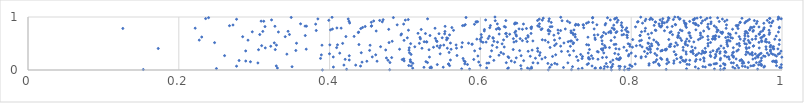
| Category | Series 0 |
|---|---|
| 0.3905048198245329 | 0.001 |
| 0.7738127976888061 | 0.002 |
| 0.6900753211355986 | 0.003 |
| 0.7908255134271223 | 0.004 |
| 0.4796547988831211 | 0.005 |
| 0.7970201570726542 | 0.006 |
| 0.7208183194869331 | 0.007 |
| 0.9183959894101316 | 0.008 |
| 0.15294919381346206 | 0.009 |
| 0.846394380932775 | 0.01 |
| 0.922346852742754 | 0.011 |
| 0.42253959025184973 | 0.012 |
| 0.784544756717684 | 0.013 |
| 0.9676414386958906 | 0.014 |
| 0.7953047466959094 | 0.015 |
| 0.6653484240710663 | 0.016 |
| 0.5856118271513883 | 0.017 |
| 0.6542613000240567 | 0.018 |
| 0.9103594176026336 | 0.019 |
| 0.7638921585774706 | 0.02 |
| 0.7299505027760544 | 0.021 |
| 0.5751593932999293 | 0.022 |
| 0.7974040987820787 | 0.023 |
| 0.8733977197972445 | 0.024 |
| 0.8890820511830615 | 0.025 |
| 0.9235077114308794 | 0.026 |
| 0.2499094500486988 | 0.027 |
| 0.6361368216130133 | 0.028 |
| 0.6677869760505721 | 0.029 |
| 0.9237443775877484 | 0.03 |
| 0.9375329926575916 | 0.031 |
| 0.7520016153193633 | 0.032 |
| 0.734953070227601 | 0.033 |
| 0.5102352320256716 | 0.034 |
| 0.7591149152228475 | 0.035 |
| 0.6625331058925109 | 0.036 |
| 0.3307786703149538 | 0.037 |
| 0.7525126982944311 | 0.038 |
| 0.6371302979966856 | 0.039 |
| 0.6082745748076372 | 0.04 |
| 0.942459709398385 | 0.041 |
| 0.535119084347013 | 0.042 |
| 0.533118979787762 | 0.043 |
| 0.759464547152684 | 0.044 |
| 0.9546954003962151 | 0.045 |
| 0.9989041471396894 | 0.046 |
| 0.710180595630532 | 0.047 |
| 0.7733843117872463 | 0.048 |
| 0.9969484423284773 | 0.049 |
| 0.69197578105246 | 0.05 |
| 0.5251347392804779 | 0.051 |
| 0.6677748083590128 | 0.052 |
| 0.5507109747615511 | 0.053 |
| 0.9760164124028549 | 0.054 |
| 0.9347862776638626 | 0.055 |
| 0.40503388160841103 | 0.056 |
| 0.8983183733666544 | 0.057 |
| 0.8850537342346565 | 0.058 |
| 0.5345463826150181 | 0.059 |
| 0.7685426735535689 | 0.06 |
| 0.7916203923650474 | 0.061 |
| 0.3502188485587554 | 0.062 |
| 0.7221779189248643 | 0.063 |
| 0.8951263731724802 | 0.064 |
| 0.9510541901273755 | 0.065 |
| 0.764713271073447 | 0.066 |
| 0.7855349146808733 | 0.067 |
| 0.8010623038665897 | 0.068 |
| 0.7747429464981311 | 0.069 |
| 0.9769238045720872 | 0.07 |
| 0.7836980896393945 | 0.071 |
| 0.27660855486428404 | 0.072 |
| 0.947489758424717 | 0.073 |
| 0.44103963272965263 | 0.074 |
| 0.9183061743754898 | 0.075 |
| 0.7480713557899352 | 0.076 |
| 0.32927721329372617 | 0.077 |
| 0.9586406092406937 | 0.078 |
| 0.5083031809050245 | 0.079 |
| 0.9616354059344437 | 0.08 |
| 0.9927060711275126 | 0.081 |
| 0.6535575016207752 | 0.082 |
| 0.5591746220625606 | 0.083 |
| 0.5050097144331767 | 0.084 |
| 0.9728175108331906 | 0.085 |
| 0.9403193579383974 | 0.086 |
| 0.8373695138190237 | 0.087 |
| 0.5998307010535655 | 0.088 |
| 0.7987470262009593 | 0.089 |
| 0.9630016841809999 | 0.09 |
| 0.8235845673075779 | 0.091 |
| 0.43463895545624476 | 0.092 |
| 0.4189924506640238 | 0.093 |
| 0.79818685802427 | 0.094 |
| 0.92431549416155 | 0.095 |
| 0.9053916399881311 | 0.096 |
| 0.9034092963105984 | 0.097 |
| 0.9690382058839365 | 0.098 |
| 0.6942717289491019 | 0.099 |
| 0.9716354357963808 | 0.1 |
| 0.9990896823401126 | 0.101 |
| 0.542846689022822 | 0.102 |
| 0.8769924625597483 | 0.103 |
| 0.5828850139414581 | 0.104 |
| 0.7416592290282833 | 0.105 |
| 0.9725322339929973 | 0.106 |
| 0.8740272073842016 | 0.107 |
| 0.7755918448350752 | 0.108 |
| 0.7016887131137876 | 0.109 |
| 0.924225238487193 | 0.11 |
| 0.5576051586932478 | 0.111 |
| 0.8053340831928248 | 0.112 |
| 0.5579664821670706 | 0.113 |
| 0.8361376299534353 | 0.114 |
| 0.9098438195560918 | 0.115 |
| 0.5793100637340978 | 0.116 |
| 0.8471633120094336 | 0.117 |
| 0.9114435994927238 | 0.118 |
| 0.8237766928915955 | 0.119 |
| 0.9223498850270061 | 0.12 |
| 0.7432982188990607 | 0.121 |
| 0.7668727416283404 | 0.122 |
| 0.9133156376722242 | 0.123 |
| 0.689494486758474 | 0.124 |
| 0.698679315955748 | 0.125 |
| 0.5103847923105798 | 0.126 |
| 0.9473556615162251 | 0.127 |
| 0.8564774082304634 | 0.128 |
| 0.6085994240771182 | 0.129 |
| 0.9493056169688389 | 0.13 |
| 0.6762094366822575 | 0.131 |
| 0.6112405184097952 | 0.132 |
| 0.3049022149635786 | 0.133 |
| 0.9356267606062876 | 0.134 |
| 0.7160297520842237 | 0.135 |
| 0.6698222393719883 | 0.136 |
| 0.93273133067166 | 0.137 |
| 0.634361254721083 | 0.138 |
| 0.966071798043755 | 0.139 |
| 0.5298525448837276 | 0.14 |
| 0.48002623757039753 | 0.141 |
| 0.8297128226485253 | 0.142 |
| 0.9556050724565387 | 0.143 |
| 0.8649404119928015 | 0.144 |
| 0.992332433266072 | 0.145 |
| 0.8497557772870497 | 0.146 |
| 0.6455121986049238 | 0.147 |
| 0.44301359714450084 | 0.148 |
| 0.9702074801588696 | 0.149 |
| 0.7724911567344178 | 0.15 |
| 0.5977242050650646 | 0.151 |
| 0.9923988639393452 | 0.152 |
| 0.5076992561731757 | 0.153 |
| 0.9910959339580765 | 0.154 |
| 0.29502350838615865 | 0.155 |
| 0.579757283092441 | 0.156 |
| 0.8321623955699313 | 0.157 |
| 0.52776673404453 | 0.158 |
| 0.9482539184859526 | 0.159 |
| 0.507182523518833 | 0.16 |
| 0.8715274948157787 | 0.161 |
| 0.9874650308803252 | 0.162 |
| 0.9909244161141505 | 0.163 |
| 0.885132931777684 | 0.164 |
| 0.44944410227184917 | 0.165 |
| 0.4629405962570402 | 0.166 |
| 0.896643527750759 | 0.167 |
| 0.9889312491729748 | 0.168 |
| 0.2887995272802497 | 0.169 |
| 0.6409761024491336 | 0.17 |
| 0.869504589363017 | 0.171 |
| 0.4988583006810122 | 0.172 |
| 0.9921756153152845 | 0.173 |
| 0.5781731854843514 | 0.174 |
| 0.8567765315898193 | 0.175 |
| 0.6573653935891627 | 0.176 |
| 0.9723230679431301 | 0.177 |
| 0.9441889491427792 | 0.178 |
| 0.2799783225614374 | 0.179 |
| 0.7294991574946279 | 0.18 |
| 0.8682288553560442 | 0.181 |
| 0.6178135959530986 | 0.182 |
| 0.4774909367036442 | 0.183 |
| 0.8776654929049373 | 0.184 |
| 0.8477354901802311 | 0.185 |
| 0.7756724727887526 | 0.186 |
| 0.9464254621082216 | 0.187 |
| 0.5602319631201716 | 0.188 |
| 0.4260653617473298 | 0.189 |
| 0.87263242646728 | 0.19 |
| 0.9181523275914827 | 0.191 |
| 0.5070183296776569 | 0.192 |
| 0.7839816287756269 | 0.193 |
| 0.9460160305918139 | 0.194 |
| 0.8338318383704196 | 0.195 |
| 0.8915843209296537 | 0.196 |
| 0.4963372535687389 | 0.197 |
| 0.8862606794970882 | 0.198 |
| 0.591182431832893 | 0.199 |
| 0.7826677476516241 | 0.2 |
| 0.42064484612108965 | 0.201 |
| 0.8404794192434666 | 0.202 |
| 0.7559436175606832 | 0.203 |
| 0.9300797609897403 | 0.204 |
| 0.8477100597541902 | 0.205 |
| 0.9613910416828884 | 0.206 |
| 0.7448426278076455 | 0.207 |
| 0.6815906094707226 | 0.208 |
| 0.9391368264391353 | 0.209 |
| 0.4984119645310988 | 0.21 |
| 0.7852359698325326 | 0.211 |
| 0.8605301011424753 | 0.212 |
| 0.7806533962078845 | 0.213 |
| 0.743492988292327 | 0.214 |
| 0.8965481578206239 | 0.215 |
| 0.7348575673843664 | 0.216 |
| 0.5770352870150887 | 0.217 |
| 0.7491988056370171 | 0.218 |
| 0.3879706443505363 | 0.219 |
| 0.7855216471639646 | 0.22 |
| 0.9185531407843436 | 0.221 |
| 0.6729986588398739 | 0.222 |
| 0.9646484859521983 | 0.223 |
| 0.8389647195745639 | 0.224 |
| 0.866157231915592 | 0.225 |
| 0.9727951960564738 | 0.226 |
| 0.4753480419934908 | 0.227 |
| 0.813122198089388 | 0.228 |
| 0.6475717271643303 | 0.229 |
| 0.8962123379010755 | 0.23 |
| 0.9108825621572619 | 0.231 |
| 0.7853487594740882 | 0.232 |
| 0.6376520321420185 | 0.233 |
| 0.4823238551205722 | 0.234 |
| 0.7618527829335777 | 0.235 |
| 0.6859746532647791 | 0.236 |
| 0.7435010088604157 | 0.237 |
| 0.8655931522306748 | 0.238 |
| 0.7672084481055781 | 0.239 |
| 0.9355234220667608 | 0.24 |
| 0.9681389549792941 | 0.241 |
| 0.9997743368160172 | 0.242 |
| 0.8664601187075355 | 0.243 |
| 0.53243417797288 | 0.244 |
| 0.9270682609071882 | 0.245 |
| 0.4049015163326366 | 0.246 |
| 0.4565892964918806 | 0.247 |
| 0.9293163249125177 | 0.248 |
| 0.8133097447549086 | 0.249 |
| 0.6366522557305938 | 0.25 |
| 0.727496224140092 | 0.251 |
| 0.6130014935722449 | 0.252 |
| 0.8193083648419252 | 0.253 |
| 0.7354140293840192 | 0.254 |
| 0.9055043521704887 | 0.255 |
| 0.6956883212847721 | 0.256 |
| 0.9775440492196866 | 0.257 |
| 0.9670627941035506 | 0.258 |
| 0.6661481255692753 | 0.259 |
| 0.8058565206178134 | 0.26 |
| 0.9355817059524196 | 0.261 |
| 0.9926301299005293 | 0.262 |
| 0.9122920737318438 | 0.263 |
| 0.5966650949846769 | 0.264 |
| 0.9755700978322602 | 0.265 |
| 0.7963834862608575 | 0.266 |
| 0.9239809087555968 | 0.267 |
| 0.7473437979894372 | 0.268 |
| 0.4260850619942349 | 0.269 |
| 0.6540159780880359 | 0.27 |
| 0.26070813783748203 | 0.271 |
| 0.9684047338388904 | 0.272 |
| 0.8855555135407566 | 0.273 |
| 0.5689402559297834 | 0.274 |
| 0.9048489507464735 | 0.275 |
| 0.8339455305390763 | 0.276 |
| 0.6785031581746722 | 0.277 |
| 0.9337379535304571 | 0.278 |
| 0.6246556032814755 | 0.279 |
| 0.718256247288025 | 0.28 |
| 0.9608263153432135 | 0.281 |
| 0.9692144381258884 | 0.282 |
| 0.9824585509622947 | 0.283 |
| 0.9903882715048147 | 0.284 |
| 0.3890693263727144 | 0.285 |
| 0.4611471655100351 | 0.286 |
| 0.6998582210593802 | 0.287 |
| 0.8591244653839057 | 0.288 |
| 0.8592585096127306 | 0.289 |
| 0.8870240463235707 | 0.29 |
| 0.9519746592076717 | 0.291 |
| 0.7970562479190516 | 0.292 |
| 0.7329716149301965 | 0.293 |
| 0.5080712048072082 | 0.294 |
| 0.7830120866578194 | 0.295 |
| 0.9878360028228746 | 0.296 |
| 0.911986835627041 | 0.297 |
| 0.9575543880836366 | 0.298 |
| 0.34333754534861893 | 0.299 |
| 0.8729785055633068 | 0.3 |
| 0.9951155497493592 | 0.301 |
| 0.9706932738576499 | 0.302 |
| 0.9646337005420591 | 0.303 |
| 0.630682838007863 | 0.304 |
| 0.546666840271846 | 0.305 |
| 0.39985322392144784 | 0.306 |
| 0.8931370812355006 | 0.307 |
| 0.9597793893040015 | 0.308 |
| 0.8822808438461663 | 0.309 |
| 0.8314753855106842 | 0.31 |
| 0.8215560619480633 | 0.311 |
| 0.9969552105152242 | 0.312 |
| 0.7782493083518334 | 0.313 |
| 0.9856587898547939 | 0.314 |
| 0.9175906601865808 | 0.315 |
| 0.9723036699955756 | 0.316 |
| 0.8895916155363729 | 0.317 |
| 0.4134429152887925 | 0.318 |
| 0.9804526616097438 | 0.319 |
| 0.7430210403074496 | 0.32 |
| 0.8001194457357172 | 0.321 |
| 0.7636581795615526 | 0.322 |
| 0.9345188266496353 | 0.323 |
| 0.8972222813167886 | 0.324 |
| 0.5059608136373772 | 0.325 |
| 0.4420129811767951 | 0.326 |
| 0.6792088472514833 | 0.327 |
| 0.9550018067151145 | 0.328 |
| 0.9604165300404404 | 0.329 |
| 0.6272904704687595 | 0.33 |
| 0.558523774249997 | 0.331 |
| 0.8957251475126037 | 0.332 |
| 0.9256137869143986 | 0.333 |
| 0.8256942796292603 | 0.334 |
| 0.9050727952087161 | 0.335 |
| 0.9356758666746396 | 0.336 |
| 0.9244857371512678 | 0.337 |
| 0.8983627801176337 | 0.338 |
| 0.8988743964622421 | 0.339 |
| 0.7563493394326682 | 0.34 |
| 0.8810756920266689 | 0.341 |
| 0.9529094692235792 | 0.342 |
| 0.8726701841772052 | 0.343 |
| 0.917978892457645 | 0.344 |
| 0.8569429343600867 | 0.345 |
| 0.8789388407108232 | 0.346 |
| 0.9135120000856275 | 0.347 |
| 0.755078026435645 | 0.348 |
| 0.9246520609603612 | 0.349 |
| 0.8175947043738852 | 0.35 |
| 0.7075256184772548 | 0.351 |
| 0.716030279281829 | 0.352 |
| 0.66335307622401 | 0.353 |
| 0.6760451565302255 | 0.354 |
| 0.9846673176869899 | 0.355 |
| 0.9987107927718256 | 0.356 |
| 0.9400574904743226 | 0.357 |
| 0.8393339833614427 | 0.358 |
| 0.8945947476658404 | 0.359 |
| 0.28871485922514095 | 0.36 |
| 0.5923684082132373 | 0.361 |
| 0.6148222602037327 | 0.362 |
| 0.723646045699635 | 0.363 |
| 0.9084513547933635 | 0.364 |
| 0.8407929431929674 | 0.365 |
| 0.6520476979799138 | 0.366 |
| 0.7939731264819646 | 0.367 |
| 0.3552315914914007 | 0.368 |
| 0.8816267474010233 | 0.369 |
| 0.4530746484152609 | 0.37 |
| 0.8412611075171174 | 0.371 |
| 0.7620864032436726 | 0.372 |
| 0.8689554154861073 | 0.373 |
| 0.5053125941467757 | 0.374 |
| 0.6686259668389901 | 0.375 |
| 0.8453986539256888 | 0.376 |
| 0.9848150189356388 | 0.377 |
| 0.4744088013836898 | 0.378 |
| 0.8463195387029268 | 0.379 |
| 0.9143001359176259 | 0.38 |
| 0.942070251308675 | 0.381 |
| 0.531887025422697 | 0.382 |
| 0.30575636498814585 | 0.383 |
| 0.8254101283222204 | 0.384 |
| 0.32793719440508085 | 0.385 |
| 0.6435089782380446 | 0.386 |
| 0.7446218718129943 | 0.387 |
| 0.8451889925263066 | 0.388 |
| 0.8226878635964546 | 0.389 |
| 0.9790766130024537 | 0.39 |
| 0.5611496744202351 | 0.391 |
| 0.49281558334702047 | 0.392 |
| 0.36899034704689215 | 0.393 |
| 0.7840466693685529 | 0.394 |
| 0.8468021600259844 | 0.395 |
| 0.9891360647790911 | 0.396 |
| 0.7603618255111213 | 0.397 |
| 0.9945819492323791 | 0.398 |
| 0.8348488396508623 | 0.399 |
| 0.8251410433875213 | 0.4 |
| 0.9529900849784004 | 0.401 |
| 0.7796795737227212 | 0.402 |
| 0.5995437381409277 | 0.403 |
| 0.9162857960473231 | 0.404 |
| 0.7628400678817064 | 0.405 |
| 0.1727298877478266 | 0.406 |
| 0.9882387925049225 | 0.407 |
| 0.6757833315844515 | 0.408 |
| 0.8981278657930719 | 0.409 |
| 0.5224915232138482 | 0.41 |
| 0.5561325488487401 | 0.411 |
| 0.5683149957773895 | 0.412 |
| 0.9227966882797838 | 0.413 |
| 0.8209705818883647 | 0.414 |
| 0.8848724664122971 | 0.415 |
| 0.9698034711794737 | 0.416 |
| 0.31471303438863363 | 0.417 |
| 0.5056352693387907 | 0.418 |
| 0.5457514406196945 | 0.419 |
| 0.9354570495011455 | 0.42 |
| 0.956381239360766 | 0.421 |
| 0.40932488897771047 | 0.422 |
| 0.7712072956283318 | 0.423 |
| 0.9524720807416701 | 0.424 |
| 0.6923989407978524 | 0.425 |
| 0.7659896348065686 | 0.426 |
| 0.6218862798357679 | 0.427 |
| 0.8689127264312331 | 0.428 |
| 0.5377897220380246 | 0.429 |
| 0.7902990773416146 | 0.43 |
| 0.8016431912098527 | 0.431 |
| 0.9875360293011155 | 0.432 |
| 0.5752136217628165 | 0.433 |
| 0.6315851892998734 | 0.434 |
| 0.9842004278222464 | 0.435 |
| 0.8144809253660735 | 0.436 |
| 0.8804551687359998 | 0.437 |
| 0.5130141562961505 | 0.438 |
| 0.9787327848878234 | 0.439 |
| 0.4676235970247018 | 0.44 |
| 0.9887921591398791 | 0.441 |
| 0.8246894115088981 | 0.442 |
| 0.8504876787657982 | 0.443 |
| 0.8519677351341803 | 0.444 |
| 0.8576301784818612 | 0.445 |
| 0.7982629509399933 | 0.446 |
| 0.7193431815231972 | 0.447 |
| 0.3219629912248907 | 0.448 |
| 0.9618730435560372 | 0.449 |
| 0.7064089862000379 | 0.45 |
| 0.9279328774906123 | 0.451 |
| 0.9019425703477788 | 0.452 |
| 0.5426944353778304 | 0.453 |
| 0.9190507267668384 | 0.454 |
| 0.8273794670322691 | 0.455 |
| 0.9437497466922254 | 0.456 |
| 0.962446441885422 | 0.457 |
| 0.80685945191753 | 0.458 |
| 0.3098895784996917 | 0.459 |
| 0.5470716668739695 | 0.46 |
| 0.7647416126236662 | 0.461 |
| 0.6983702320443509 | 0.462 |
| 0.8748429839363828 | 0.463 |
| 0.9850140839918202 | 0.464 |
| 0.6158649377932753 | 0.465 |
| 0.8118508713763118 | 0.466 |
| 0.4537235628338929 | 0.467 |
| 0.3898918121767959 | 0.468 |
| 0.3295177177177565 | 0.469 |
| 0.5514469844194054 | 0.47 |
| 0.7435633027605243 | 0.471 |
| 0.8613212003908864 | 0.472 |
| 0.5677782309792232 | 0.473 |
| 0.4003027841826645 | 0.474 |
| 0.41047356416981173 | 0.475 |
| 0.8363274899026777 | 0.476 |
| 0.851420281952596 | 0.477 |
| 0.7409260309164332 | 0.478 |
| 0.8719780499510947 | 0.479 |
| 0.4389231500238694 | 0.48 |
| 0.7773227612022293 | 0.481 |
| 0.9962115370051601 | 0.482 |
| 0.7980481440964858 | 0.483 |
| 0.588842975371041 | 0.484 |
| 0.7797127370041431 | 0.485 |
| 0.9271481763962652 | 0.486 |
| 0.9527674852048552 | 0.487 |
| 0.9402955598185356 | 0.488 |
| 0.8527239782172956 | 0.489 |
| 0.5890722354862572 | 0.49 |
| 0.7616633926315168 | 0.491 |
| 0.8268710057141122 | 0.492 |
| 0.6287849886942929 | 0.493 |
| 0.7005932475167914 | 0.494 |
| 0.7959559101315303 | 0.495 |
| 0.7229387341531645 | 0.496 |
| 0.5074998912320667 | 0.497 |
| 0.9506627948236427 | 0.498 |
| 0.9018692175985539 | 0.499 |
| 0.9431354547770805 | 0.5 |
| 0.82294273156 | 0.501 |
| 0.41729402695472506 | 0.502 |
| 0.5190660288704839 | 0.503 |
| 0.8715877233517451 | 0.504 |
| 0.3561202050453607 | 0.505 |
| 0.5842818857204514 | 0.506 |
| 0.835264205193221 | 0.507 |
| 0.5602576394037801 | 0.508 |
| 0.8222197943191835 | 0.509 |
| 0.7107880568859066 | 0.51 |
| 0.9576759115886764 | 0.511 |
| 0.3266492084276321 | 0.512 |
| 0.859293608748415 | 0.513 |
| 0.7236134185712629 | 0.514 |
| 0.5760435167975357 | 0.515 |
| 0.2474448360967222 | 0.516 |
| 0.47882524822412864 | 0.517 |
| 0.982941063469815 | 0.518 |
| 0.9052742752253088 | 0.519 |
| 0.9566687055296355 | 0.52 |
| 0.96946412566711 | 0.521 |
| 0.6034209981173205 | 0.522 |
| 0.9268629433397785 | 0.523 |
| 0.6899047806884824 | 0.524 |
| 0.6226950797140344 | 0.525 |
| 0.6075839656446996 | 0.526 |
| 0.6444924758821189 | 0.527 |
| 0.9796243745441906 | 0.528 |
| 0.529034291066476 | 0.529 |
| 0.8830509153633506 | 0.53 |
| 0.833223534293191 | 0.531 |
| 0.5283584798991774 | 0.532 |
| 0.525430398062077 | 0.533 |
| 0.7164394867382189 | 0.534 |
| 0.9730902577309443 | 0.535 |
| 0.662167529718266 | 0.536 |
| 0.872339007870667 | 0.537 |
| 0.5424714163765 | 0.538 |
| 0.9777043180163018 | 0.539 |
| 0.6009122877075467 | 0.54 |
| 0.6179090811515956 | 0.541 |
| 0.4830231841741378 | 0.542 |
| 0.6475292937067069 | 0.543 |
| 0.8769683362315284 | 0.544 |
| 0.7194331968021954 | 0.545 |
| 0.9311199281417896 | 0.546 |
| 0.7207759235411916 | 0.547 |
| 0.66962506991878 | 0.548 |
| 0.8111181505726346 | 0.549 |
| 0.9494413401377514 | 0.55 |
| 0.7612451388920078 | 0.551 |
| 0.5416342414585319 | 0.552 |
| 0.9269331744181315 | 0.553 |
| 0.6556843498955518 | 0.554 |
| 0.9729366594421212 | 0.555 |
| 0.7732665460023014 | 0.556 |
| 0.8668020628625894 | 0.557 |
| 0.9553537981830027 | 0.558 |
| 0.49872890048465635 | 0.559 |
| 0.6859683945244304 | 0.56 |
| 0.8135340304676589 | 0.561 |
| 0.9289842922474785 | 0.562 |
| 0.2917835619598784 | 0.563 |
| 0.22711935612551204 | 0.564 |
| 0.6983320105140552 | 0.565 |
| 0.9967472619700803 | 0.566 |
| 0.8299820376017294 | 0.567 |
| 0.6307313349502586 | 0.568 |
| 0.5551691537207536 | 0.569 |
| 0.6820761174648662 | 0.57 |
| 0.7283594230984064 | 0.571 |
| 0.9020448064165993 | 0.572 |
| 0.8891600808634503 | 0.573 |
| 0.8020110534795035 | 0.574 |
| 0.8498581461615726 | 0.575 |
| 0.7523649595078805 | 0.576 |
| 0.9604695573184543 | 0.577 |
| 0.5997178862284139 | 0.578 |
| 0.9110923162676643 | 0.579 |
| 0.9788273984649201 | 0.58 |
| 0.9903954786522264 | 0.581 |
| 0.5953010807796044 | 0.582 |
| 0.9446512406227519 | 0.583 |
| 0.8738208336089903 | 0.584 |
| 0.9080886134381388 | 0.585 |
| 0.965003617015023 | 0.586 |
| 0.5204639033209739 | 0.587 |
| 0.9078948975647427 | 0.588 |
| 0.9113503526883316 | 0.589 |
| 0.9506651079154897 | 0.59 |
| 0.6437243441327519 | 0.591 |
| 0.652725957924731 | 0.592 |
| 0.6604222277510106 | 0.593 |
| 0.6102213334498828 | 0.594 |
| 0.891756445993135 | 0.595 |
| 0.5402696121456597 | 0.596 |
| 0.5566294989405232 | 0.597 |
| 0.6169750422860572 | 0.598 |
| 0.8651807692490544 | 0.599 |
| 0.7051681885568541 | 0.6 |
| 0.9343410997614713 | 0.601 |
| 0.9110856687159091 | 0.602 |
| 0.7519826032376935 | 0.603 |
| 0.8239954312869184 | 0.604 |
| 0.9718586449297097 | 0.605 |
| 0.5554366618046848 | 0.606 |
| 0.5030933124996808 | 0.607 |
| 0.5493527723570168 | 0.608 |
| 0.879210801982463 | 0.609 |
| 0.616647582630679 | 0.61 |
| 0.7948993713669005 | 0.611 |
| 0.9252538576506794 | 0.612 |
| 0.9319739379832827 | 0.613 |
| 0.8616342635814179 | 0.614 |
| 0.5198800272721783 | 0.615 |
| 0.6015384402765295 | 0.616 |
| 0.7780302885468758 | 0.617 |
| 0.760283605229878 | 0.618 |
| 0.7426481275928535 | 0.619 |
| 0.8945528338364186 | 0.62 |
| 0.973797290858038 | 0.621 |
| 0.23042761114269372 | 0.622 |
| 0.7258636296247306 | 0.623 |
| 0.6633638634767145 | 0.624 |
| 0.9284011412677968 | 0.625 |
| 0.8622188385567167 | 0.626 |
| 0.9164029283008722 | 0.627 |
| 0.2847144022859758 | 0.628 |
| 0.34115213908126574 | 0.629 |
| 0.9432374641091902 | 0.63 |
| 0.4216300446433465 | 0.631 |
| 0.6351898223880559 | 0.632 |
| 0.908809360234564 | 0.633 |
| 0.4325208393527774 | 0.634 |
| 0.9016157720660577 | 0.635 |
| 0.61183272960539 | 0.636 |
| 0.9551157676403885 | 0.637 |
| 0.9654946027682291 | 0.638 |
| 0.8623232269513451 | 0.639 |
| 0.9922604347617819 | 0.64 |
| 0.6478270557631702 | 0.641 |
| 0.9113080161596351 | 0.642 |
| 0.9761895282023658 | 0.643 |
| 0.7618203151469959 | 0.644 |
| 0.9507806991501394 | 0.645 |
| 0.8779657277748598 | 0.646 |
| 0.9121570300863472 | 0.647 |
| 0.8117637949330566 | 0.648 |
| 0.6630003622509055 | 0.649 |
| 0.3677318140103517 | 0.65 |
| 0.5331678975279545 | 0.651 |
| 0.8623084284952977 | 0.652 |
| 0.7946397744249817 | 0.653 |
| 0.8118509621708399 | 0.654 |
| 0.9762271338845312 | 0.655 |
| 0.8919944080033357 | 0.656 |
| 0.6974180446666094 | 0.657 |
| 0.7941742287420334 | 0.658 |
| 0.7510297305349143 | 0.659 |
| 0.49458666234596294 | 0.66 |
| 0.7877569976548596 | 0.661 |
| 0.5590568156147846 | 0.662 |
| 0.9313720931736948 | 0.663 |
| 0.7557833932606869 | 0.664 |
| 0.6472027791079876 | 0.665 |
| 0.7234028704102664 | 0.666 |
| 0.8548025862989379 | 0.667 |
| 0.601093757457466 | 0.668 |
| 0.3073775953924264 | 0.669 |
| 0.3467543946509234 | 0.67 |
| 0.7900841088024999 | 0.671 |
| 0.9829872903401604 | 0.672 |
| 0.7256566347679384 | 0.673 |
| 0.9701237293096666 | 0.674 |
| 0.6388338479548185 | 0.675 |
| 0.8224673764346505 | 0.676 |
| 0.931097113697441 | 0.677 |
| 0.6249063700986569 | 0.678 |
| 0.9694609866701519 | 0.679 |
| 0.4953544846906085 | 0.68 |
| 0.6908124006056351 | 0.681 |
| 0.9508880771512727 | 0.682 |
| 0.5525736758212333 | 0.683 |
| 0.766422231819747 | 0.684 |
| 0.5451156587499847 | 0.685 |
| 0.633424406686403 | 0.686 |
| 0.929065107700802 | 0.687 |
| 0.5271129095058956 | 0.688 |
| 0.9205015849847434 | 0.689 |
| 0.6671807501745359 | 0.69 |
| 0.6343688231245305 | 0.691 |
| 0.5172825988621195 | 0.692 |
| 0.9544253278096009 | 0.693 |
| 0.7033280226748672 | 0.694 |
| 0.722380635087679 | 0.695 |
| 0.9390191422721608 | 0.696 |
| 0.826995587789522 | 0.697 |
| 0.8918556764319672 | 0.698 |
| 0.8763290612954495 | 0.699 |
| 0.8629880792451059 | 0.7 |
| 0.7731181330935619 | 0.701 |
| 0.877270572415666 | 0.702 |
| 0.9836305166427135 | 0.703 |
| 0.7203210982519866 | 0.704 |
| 0.851382793079069 | 0.705 |
| 0.7798481325053769 | 0.706 |
| 0.43806864452314176 | 0.707 |
| 0.6456881608204867 | 0.708 |
| 0.7635362229393039 | 0.709 |
| 0.7701984552177321 | 0.71 |
| 0.9211646078158061 | 0.711 |
| 0.9207398060211561 | 0.712 |
| 0.9186415998846345 | 0.713 |
| 0.43852570610594865 | 0.714 |
| 0.7959747364824539 | 0.715 |
| 0.9952096708167033 | 0.716 |
| 0.3320888277184062 | 0.717 |
| 0.9715668630504889 | 0.718 |
| 0.9136129738763925 | 0.719 |
| 0.2974646421378454 | 0.72 |
| 0.8136491498052544 | 0.721 |
| 0.9526933502207231 | 0.722 |
| 0.8529560562969009 | 0.723 |
| 0.781053701308839 | 0.724 |
| 0.9512883399396974 | 0.725 |
| 0.7944909751664482 | 0.726 |
| 0.5529738724936867 | 0.727 |
| 0.3114282322384727 | 0.728 |
| 0.9614660915835903 | 0.729 |
| 0.34492984242373825 | 0.73 |
| 0.6922785842732293 | 0.731 |
| 0.646838343171489 | 0.732 |
| 0.7725872503191392 | 0.733 |
| 0.818224962890696 | 0.734 |
| 0.8961172170431082 | 0.735 |
| 0.46179041733226034 | 0.736 |
| 0.6051881899005328 | 0.737 |
| 0.720171809077406 | 0.738 |
| 0.9743469162571132 | 0.739 |
| 0.8675303729416926 | 0.74 |
| 0.8441223651964207 | 0.741 |
| 0.6899274101078352 | 0.742 |
| 0.7874543716621346 | 0.743 |
| 0.706413110598987 | 0.744 |
| 0.38227723414403303 | 0.745 |
| 0.8327589828600658 | 0.746 |
| 0.9620734202072113 | 0.747 |
| 0.56435127191568 | 0.748 |
| 0.9153315010226958 | 0.749 |
| 0.9828143738476308 | 0.75 |
| 0.5045618745178669 | 0.751 |
| 0.8318798328812578 | 0.752 |
| 0.9569250130265403 | 0.753 |
| 0.7028619035644227 | 0.754 |
| 0.8651081844241931 | 0.755 |
| 0.7240802292008813 | 0.756 |
| 0.4012109132733158 | 0.757 |
| 0.8857853710286316 | 0.758 |
| 0.6901780419410294 | 0.759 |
| 0.9142137168414174 | 0.76 |
| 0.7924038936990484 | 0.761 |
| 0.6806119767459096 | 0.762 |
| 0.7774718675284488 | 0.763 |
| 0.605319148059383 | 0.764 |
| 0.5215130593823386 | 0.765 |
| 0.9573288532669522 | 0.766 |
| 0.47839754112555744 | 0.767 |
| 0.6557175825915248 | 0.768 |
| 0.9344423740681248 | 0.769 |
| 0.6211850769004971 | 0.77 |
| 0.6254947395595328 | 0.771 |
| 0.97578005128533 | 0.772 |
| 0.4037771979252043 | 0.773 |
| 0.7126056265034759 | 0.774 |
| 0.7508593488221352 | 0.775 |
| 0.6512597613672594 | 0.776 |
| 0.9030739281343382 | 0.777 |
| 0.6817664877236106 | 0.778 |
| 0.7771345030284253 | 0.779 |
| 0.667473434607167 | 0.78 |
| 0.44130830616533034 | 0.781 |
| 0.9417299060659379 | 0.782 |
| 0.6610671514563096 | 0.783 |
| 0.12578570627542396 | 0.784 |
| 0.6240601371221327 | 0.785 |
| 0.9259137858846976 | 0.786 |
| 0.818905102591414 | 0.787 |
| 0.5398397680081618 | 0.788 |
| 0.22173259447554228 | 0.789 |
| 0.4152950452798748 | 0.79 |
| 0.6239654793301185 | 0.791 |
| 0.7747362121670248 | 0.792 |
| 0.4096788745365757 | 0.793 |
| 0.7940977311183586 | 0.794 |
| 0.996333989078192 | 0.795 |
| 0.7370561168951638 | 0.796 |
| 0.9763169819004358 | 0.797 |
| 0.6124078818763693 | 0.798 |
| 0.6670415294896348 | 0.799 |
| 0.9602292665695059 | 0.8 |
| 0.562174123227175 | 0.801 |
| 0.44376220872230665 | 0.802 |
| 0.8731982860384632 | 0.803 |
| 0.9127206589880196 | 0.804 |
| 0.9584042201446328 | 0.805 |
| 0.7883507827733017 | 0.806 |
| 0.9965262589125414 | 0.807 |
| 0.8478187628144019 | 0.808 |
| 0.63320183915835 | 0.809 |
| 0.8394008086196431 | 0.81 |
| 0.9013709698398668 | 0.811 |
| 0.9694728317939392 | 0.812 |
| 0.6679155942059539 | 0.813 |
| 0.8057250334660011 | 0.814 |
| 0.9628494967994665 | 0.815 |
| 0.6925046044365913 | 0.816 |
| 0.678193948158328 | 0.817 |
| 0.6949286056658438 | 0.818 |
| 0.3143386035530108 | 0.819 |
| 0.6317324018386653 | 0.82 |
| 0.44716700949177546 | 0.821 |
| 0.8544120540484808 | 0.822 |
| 0.94049397969855 | 0.823 |
| 0.5531940123695708 | 0.824 |
| 0.3275024114591877 | 0.825 |
| 0.45531816458312846 | 0.826 |
| 0.3693193119193475 | 0.827 |
| 0.36749655898203515 | 0.828 |
| 0.985174132516831 | 0.829 |
| 0.8376319831673403 | 0.83 |
| 0.8721942701355525 | 0.831 |
| 0.910146648699897 | 0.832 |
| 0.6760065284278293 | 0.833 |
| 0.840621783131765 | 0.834 |
| 0.4557447715704698 | 0.835 |
| 0.26722890133927446 | 0.836 |
| 0.5763374251852692 | 0.837 |
| 0.8891455813467025 | 0.838 |
| 0.6132841757605866 | 0.839 |
| 0.939271231734644 | 0.84 |
| 0.5786159300331716 | 0.841 |
| 0.8304478804063488 | 0.842 |
| 0.7869079697103933 | 0.843 |
| 0.7259785681747198 | 0.844 |
| 0.7365383728267396 | 0.845 |
| 0.7768565155157398 | 0.846 |
| 0.7300267811675035 | 0.847 |
| 0.942086649118899 | 0.848 |
| 0.27188976786476626 | 0.849 |
| 0.7654138219087804 | 0.85 |
| 0.9263976151228736 | 0.851 |
| 0.4896261521584603 | 0.852 |
| 0.7544784651018681 | 0.853 |
| 0.8589355242446877 | 0.854 |
| 0.7363076035973684 | 0.855 |
| 0.5799791795369064 | 0.856 |
| 0.7296082175351857 | 0.857 |
| 0.885248581943906 | 0.858 |
| 0.8584754021156175 | 0.859 |
| 0.8863947038684494 | 0.86 |
| 0.87231481604709 | 0.861 |
| 0.5921086538435246 | 0.862 |
| 0.7265562194473949 | 0.863 |
| 0.9019282664081695 | 0.864 |
| 0.38151684281232456 | 0.865 |
| 0.49819235456246336 | 0.866 |
| 0.6571021627915599 | 0.867 |
| 0.6453686918945627 | 0.868 |
| 0.6224639639083767 | 0.869 |
| 0.8369337572368937 | 0.87 |
| 0.36150259920822736 | 0.871 |
| 0.6782348409278554 | 0.872 |
| 0.6458965417916713 | 0.873 |
| 0.905665707251684 | 0.874 |
| 0.8726671789518645 | 0.875 |
| 0.9660723935993101 | 0.876 |
| 0.7661724340959485 | 0.877 |
| 0.8713295091178032 | 0.878 |
| 0.885223403984017 | 0.879 |
| 0.8411564866434589 | 0.88 |
| 0.9759038744729998 | 0.881 |
| 0.7407366163930849 | 0.882 |
| 0.6482655724729721 | 0.883 |
| 0.8150143555661998 | 0.884 |
| 0.893042810673443 | 0.885 |
| 0.882544064790593 | 0.886 |
| 0.42661334544958407 | 0.887 |
| 0.9506874888437719 | 0.888 |
| 0.8440167027799329 | 0.889 |
| 0.6460564875757674 | 0.89 |
| 0.8708818424539213 | 0.891 |
| 0.7872370983700996 | 0.892 |
| 0.9864635114352879 | 0.893 |
| 0.7184569683221371 | 0.894 |
| 0.944352615142495 | 0.895 |
| 0.9832207943107749 | 0.896 |
| 0.7489678376401357 | 0.897 |
| 0.6939392449326953 | 0.898 |
| 0.7811939242364416 | 0.899 |
| 0.45532895855689304 | 0.9 |
| 0.743413480172245 | 0.901 |
| 0.9446808876384604 | 0.902 |
| 0.8323181254105675 | 0.903 |
| 0.8083920202838768 | 0.904 |
| 0.5945188320249853 | 0.905 |
| 0.8473177563248838 | 0.906 |
| 0.9059768343103743 | 0.907 |
| 0.8318402723049251 | 0.908 |
| 0.4698917123381503 | 0.909 |
| 0.5942477846156717 | 0.91 |
| 0.5963218956892247 | 0.911 |
| 0.8091319333091109 | 0.912 |
| 0.952192072440958 | 0.913 |
| 0.8410942048375093 | 0.914 |
| 0.9167267655445204 | 0.915 |
| 0.9671533882690422 | 0.916 |
| 0.8775736761982874 | 0.917 |
| 0.9240734922984094 | 0.918 |
| 0.42575679533085686 | 0.919 |
| 0.3126461332078275 | 0.92 |
| 0.7154191355944021 | 0.921 |
| 0.30917656743089283 | 0.922 |
| 0.6906229430909193 | 0.923 |
| 0.9879549247688364 | 0.924 |
| 0.45846595687843505 | 0.925 |
| 0.8946705556640769 | 0.926 |
| 0.8699234531979266 | 0.927 |
| 0.81845349450361 | 0.928 |
| 0.7083008318773502 | 0.929 |
| 0.6196696708999073 | 0.93 |
| 0.9543480618552156 | 0.931 |
| 0.6337202380739319 | 0.932 |
| 0.9633393843991949 | 0.933 |
| 0.6758159606320887 | 0.934 |
| 0.46640308846253065 | 0.935 |
| 0.9804931473500637 | 0.936 |
| 0.3989310359609567 | 0.937 |
| 0.782593092794872 | 0.938 |
| 0.8489121655775276 | 0.939 |
| 0.6820763802220248 | 0.94 |
| 0.50042571544159 | 0.941 |
| 0.9269893164113774 | 0.942 |
| 0.7723371227381937 | 0.943 |
| 0.6069552636264322 | 0.944 |
| 0.32302064765747485 | 0.945 |
| 0.8383775002834966 | 0.946 |
| 0.8980819561078011 | 0.947 |
| 0.883291985617544 | 0.948 |
| 0.4710296956230854 | 0.949 |
| 0.8821775725201151 | 0.95 |
| 0.5043171069950785 | 0.951 |
| 0.855935482270206 | 0.952 |
| 0.8245522908652543 | 0.953 |
| 0.8281459905162959 | 0.954 |
| 0.956843442235424 | 0.955 |
| 0.9947544540593747 | 0.956 |
| 0.2766116504508167 | 0.957 |
| 0.8641695289091527 | 0.958 |
| 0.8194694606736985 | 0.959 |
| 0.6781156675358936 | 0.96 |
| 0.9209477604102373 | 0.961 |
| 0.778034084483086 | 0.962 |
| 0.4246753416530632 | 0.963 |
| 0.38445274600465873 | 0.964 |
| 0.5299325008686563 | 0.965 |
| 0.9989388666185213 | 0.966 |
| 0.6912860409650575 | 0.967 |
| 0.8647500415863589 | 0.968 |
| 0.8419494369246512 | 0.969 |
| 0.23558559601849982 | 0.97 |
| 0.7788228892893823 | 0.971 |
| 0.8842576200896582 | 0.972 |
| 0.9835823656563679 | 0.973 |
| 0.9838451350925479 | 0.974 |
| 0.9004251192632343 | 0.975 |
| 0.9468907238920136 | 0.976 |
| 0.8501998715750275 | 0.977 |
| 0.6834310414234578 | 0.978 |
| 0.8873748364104435 | 0.979 |
| 0.9960259398989184 | 0.98 |
| 0.8261012932441241 | 0.981 |
| 0.7487633623307568 | 0.982 |
| 0.7806108201627331 | 0.983 |
| 0.9146197836451588 | 0.984 |
| 0.7685492418491963 | 0.985 |
| 0.9048559964388823 | 0.986 |
| 0.23949569100816315 | 0.987 |
| 0.8492942272757571 | 0.988 |
| 0.48459482270225307 | 0.989 |
| 0.748899805924563 | 0.99 |
| 0.5809405867027507 | 0.991 |
| 0.34908599516419003 | 0.992 |
| 0.8922034108474729 | 0.993 |
| 0.40327090820474276 | 0.994 |
| 0.7065635987908927 | 0.995 |
| 0.8621178508514837 | 0.996 |
| 0.8126525724597224 | 0.997 |
| 0.9952384126807993 | 0.998 |
| 0.8578020932720808 | 0.999 |
| 0.6193167813657501 | 1 |